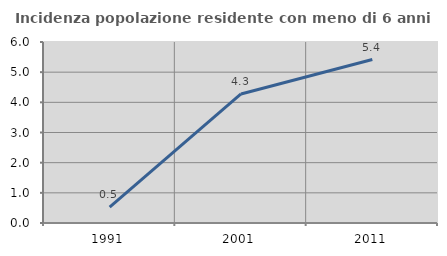
| Category | Incidenza popolazione residente con meno di 6 anni |
|---|---|
| 1991.0 | 0.524 |
| 2001.0 | 4.278 |
| 2011.0 | 5.419 |